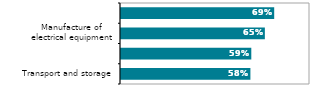
| Category | Series 0 |
|---|---|
| Transport and storage | 0.582 |
| Manufacture of 
motor vehicles | 0.586 |
| Manufacture of 
electrical equipment | 0.647 |
| Manufacture of chemicals 
or pharmaceutical products | 0.689 |